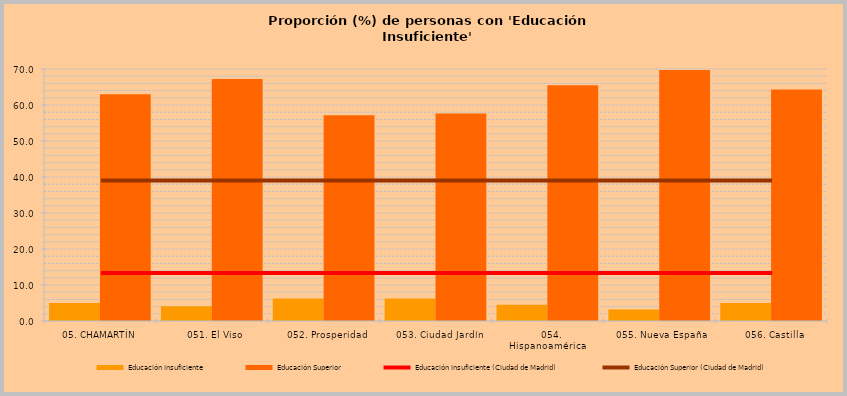
| Category | Educación Insuficiente | Educación Superior |
|---|---|---|
|  05. CHAMARTÍN | 4.997 | 63.01 |
|    051. El Viso | 4.096 | 67.191 |
|    052. Prosperidad | 6.252 | 57.142 |
|    053. Ciudad Jardín | 6.238 | 57.654 |
|    054. Hispanoamérica | 4.51 | 65.452 |
|    055. Nueva España | 3.224 | 69.689 |
|    056. Castilla | 5.024 | 64.334 |